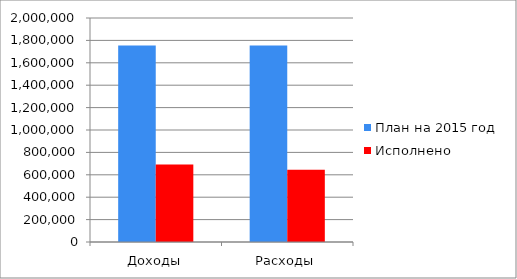
| Category | План на 2015 год | Исполнено  |
|---|---|---|
| Доходы | 1753704 | 691015 |
| Расходы | 1755206 | 644429 |